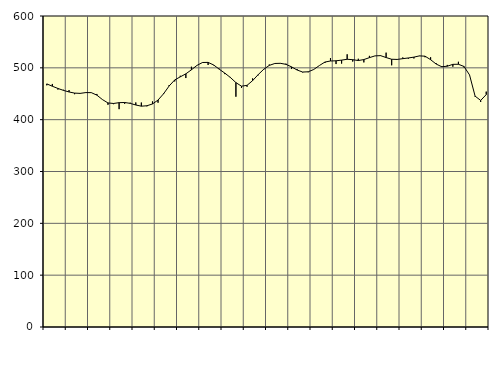
| Category | Piggar | Series 1 |
|---|---|---|
| nan | 466.3 | 469.02 |
| 1.0 | 468.9 | 464.47 |
| 1.0 | 458.1 | 460.22 |
| 1.0 | 457.6 | 456.5 |
| nan | 457 | 453.41 |
| 2.0 | 449.1 | 451.25 |
| 2.0 | 450.2 | 450.71 |
| 2.0 | 452.9 | 452.24 |
| nan | 451.9 | 452.16 |
| 3.0 | 449.6 | 447.32 |
| 3.0 | 439 | 438.81 |
| 3.0 | 428.7 | 432.27 |
| nan | 429.9 | 431.25 |
| 4.0 | 420.3 | 432.79 |
| 4.0 | 430.6 | 433.12 |
| 4.0 | 432.7 | 431.46 |
| nan | 433.2 | 428.27 |
| 5.0 | 433 | 426.01 |
| 5.0 | 425.8 | 426.84 |
| 5.0 | 435.2 | 430.27 |
| nan | 432.7 | 437.83 |
| 6.0 | 451.2 | 450.05 |
| 6.0 | 466.9 | 465.03 |
| 6.0 | 473.8 | 476.66 |
| nan | 484.7 | 482.6 |
| 7.0 | 480.3 | 488.43 |
| 7.0 | 502.1 | 496.19 |
| 7.0 | 504.8 | 504.72 |
| nan | 510.8 | 510.31 |
| 8.0 | 505.5 | 510.49 |
| 8.0 | 504.9 | 505.5 |
| 8.0 | 498.4 | 497.37 |
| nan | 487.9 | 489.85 |
| 9.0 | 482.4 | 481.43 |
| 9.0 | 444.3 | 471.51 |
| 9.0 | 461.3 | 464.62 |
| nan | 463.5 | 466.24 |
| 10.0 | 479.6 | 475.28 |
| 10.0 | 485.6 | 486.85 |
| 10.0 | 496.4 | 497.24 |
| nan | 506.4 | 504.71 |
| 11.0 | 508.2 | 508.42 |
| 11.0 | 508.3 | 508.73 |
| 11.0 | 508 | 506.75 |
| nan | 497.7 | 501.85 |
| 12.0 | 497.6 | 495.78 |
| 12.0 | 491.2 | 491.9 |
| 12.0 | 491.5 | 492.37 |
| nan | 496.9 | 496.87 |
| 13.0 | 504.4 | 504.41 |
| 13.0 | 509.3 | 511.14 |
| 13.0 | 518.8 | 513.19 |
| nan | 507.3 | 513.6 |
| 14.0 | 508.2 | 514.88 |
| 14.0 | 526.1 | 516.5 |
| 14.0 | 512.1 | 515.76 |
| nan | 517.5 | 514.07 |
| 15.0 | 510.5 | 515.94 |
| 15.0 | 523.1 | 519.65 |
| 15.0 | 523.1 | 523.07 |
| nan | 522.9 | 523.54 |
| 16.0 | 529.3 | 519.86 |
| 16.0 | 504.9 | 516.55 |
| 16.0 | 515.6 | 516.22 |
| nan | 520 | 517.68 |
| 17.0 | 517.7 | 519.06 |
| 17.0 | 518.1 | 520.63 |
| 17.0 | 522.7 | 523.07 |
| nan | 520.4 | 522.47 |
| 18.0 | 520.4 | 515.74 |
| 18.0 | 508.9 | 507.28 |
| 18.0 | 503.4 | 502.15 |
| nan | 505.6 | 503.11 |
| 19.0 | 502.2 | 506.76 |
| 19.0 | 511.7 | 506.87 |
| 19.0 | 500.9 | 502.64 |
| nan | 486.4 | 486.35 |
| 20.0 | 444.2 | 445.41 |
| 20.0 | 434.1 | 437.1 |
| 20.0 | 454.1 | 448.32 |